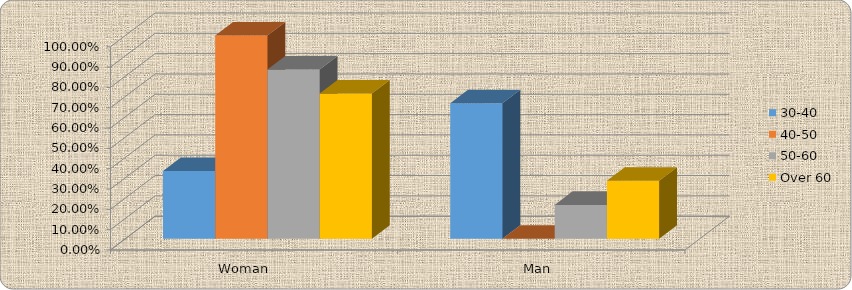
| Category | 30-40 | 40-50 | 50-60 | Over 60 |
|---|---|---|---|---|
| Woman     | 0.333 | 1 | 0.833 | 0.714 |
| Man  | 0.667 | 0 | 0.167 | 0.286 |